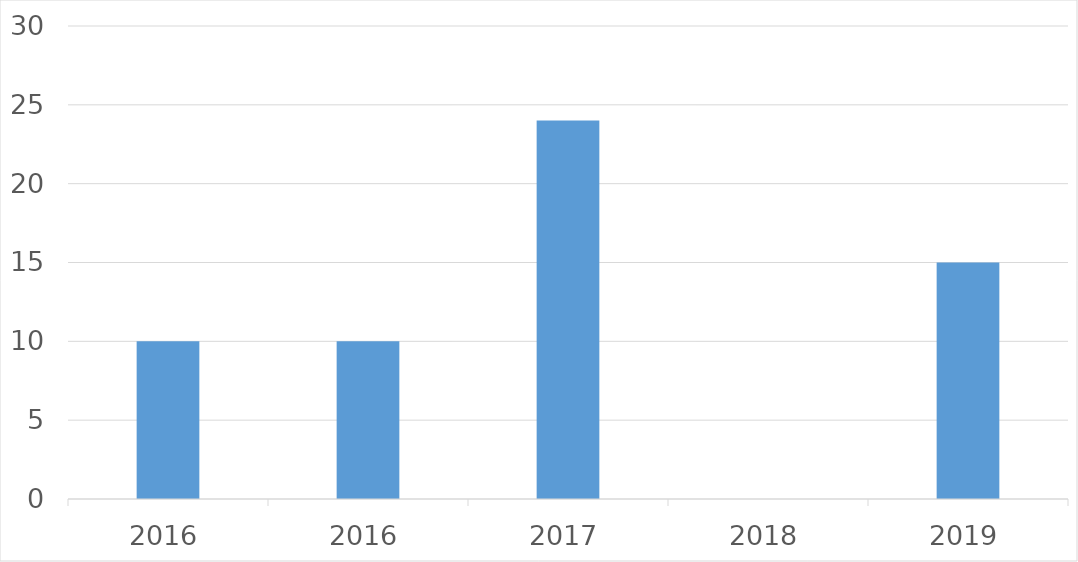
| Category | Series 0 |
|---|---|
| 2016 | 10 |
| 2016 | 10 |
| 2017 | 24 |
| 2018 | 0 |
| 2019 | 15 |